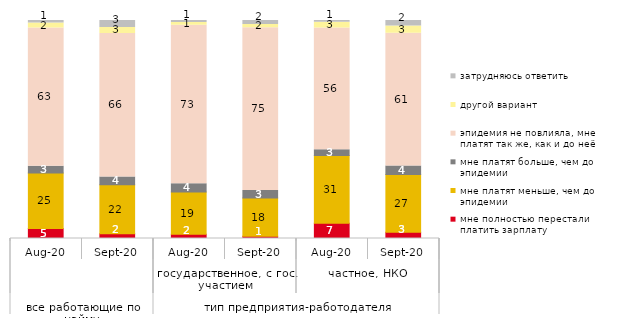
| Category | мне полностью перестали платить зарплату | мне платят меньше, чем до эпидемии | мне платят больше, чем до эпидемии | эпидемия не повлияла, мне платят так же, как и до неё | другой вариант | затрудняюсь ответить |
|---|---|---|---|---|---|---|
| 0 | 4.554 | 25.446 | 3.168 | 63.366 | 2.277 | 1.188 |
| 1 | 2.208 | 22.397 | 3.575 | 65.825 | 2.839 | 3.155 |
| 2 | 2 | 19.333 | 3.778 | 72.667 | 1.333 | 0.889 |
| 3 | 1.034 | 17.571 | 3.359 | 74.677 | 1.55 | 1.809 |
| 4 | 6.981 | 31.132 | 2.642 | 55.849 | 2.642 | 0.755 |
| 5 | 2.846 | 26.565 | 3.795 | 60.911 | 3.416 | 2.467 |